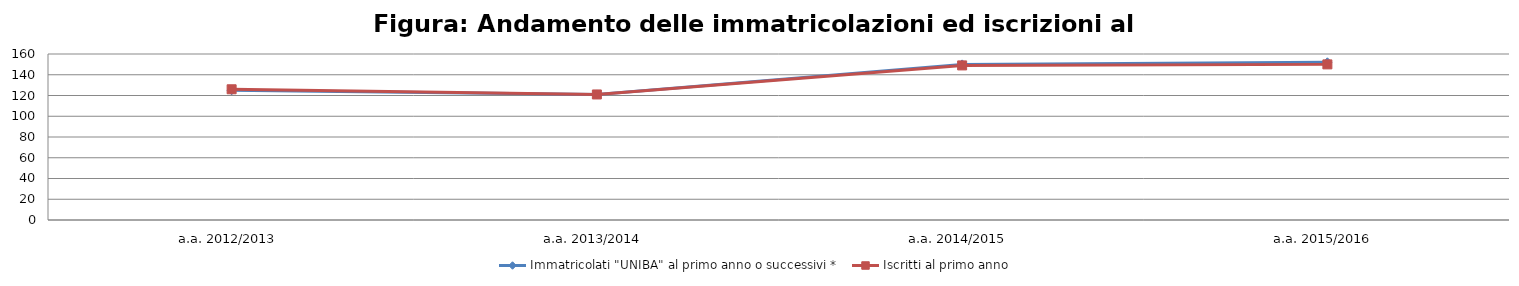
| Category | Immatricolati "UNIBA" al primo anno o successivi * | Iscritti al primo anno  |
|---|---|---|
| a.a. 2012/2013 | 125 | 126 |
| a.a. 2013/2014 | 121 | 121 |
| a.a. 2014/2015 | 150 | 149 |
| a.a. 2015/2016 | 152 | 150 |